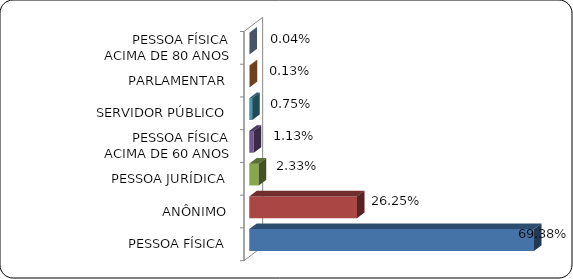
| Category | Series 0 |
|---|---|
|      PESSOA FÍSICA | 0.694 |
|      ANÔNIMO | 0.262 |
|      PESSOA JURÍDICA | 0.023 |
|      PESSOA FÍSICA ACIMA DE 60 ANOS | 0.011 |
|      SERVIDOR PÚBLICO | 0.008 |
|      PARLAMENTAR | 0.001 |
|      PESSOA FÍSICA ACIMA DE 80 ANOS | 0 |